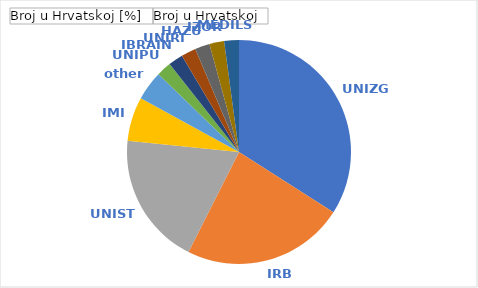
| Category | Broj u Hrvatskoj [%] | Broj u Hrvatskoj |
|---|---|---|
| UNIZG | 0.34 | 16 |
| IRB | 0.234 | 11 |
| UNIST | 0.191 | 9 |
| IMI | 0.064 | 3 |
| other | 0.043 | 2 |
| UNIPU | 0.021 | 1 |
| IBRAIN | 0.021 | 1 |
| UNIRI | 0.021 | 1 |
| HAZU | 0.021 | 1 |
| IZOR | 0.021 | 1 |
| MEDILS | 0.021 | 1 |